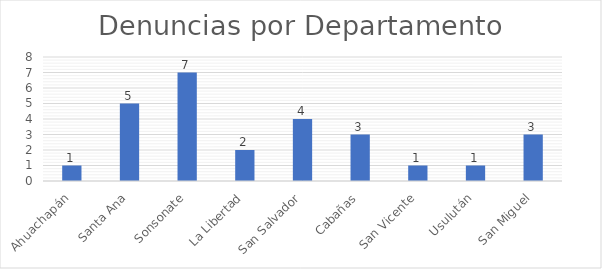
| Category | Series 0 |
|---|---|
| Ahuachapán | 1 |
| Santa Ana | 5 |
| Sonsonate | 7 |
| La Libertad | 2 |
| San Salvador | 4 |
| Cabañas | 3 |
| San Vicente | 1 |
| Usulután | 1 |
| San Miguel | 3 |